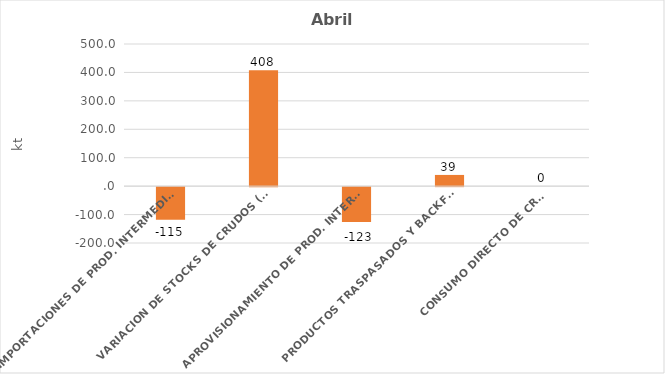
| Category | IMPORTACIONES DE CRUDO |
|---|---|
| 0 | -114.818 |
| 1 | 407.893 |
| 2 | -122.754 |
| 3 | 39.404 |
| 4 | 0 |